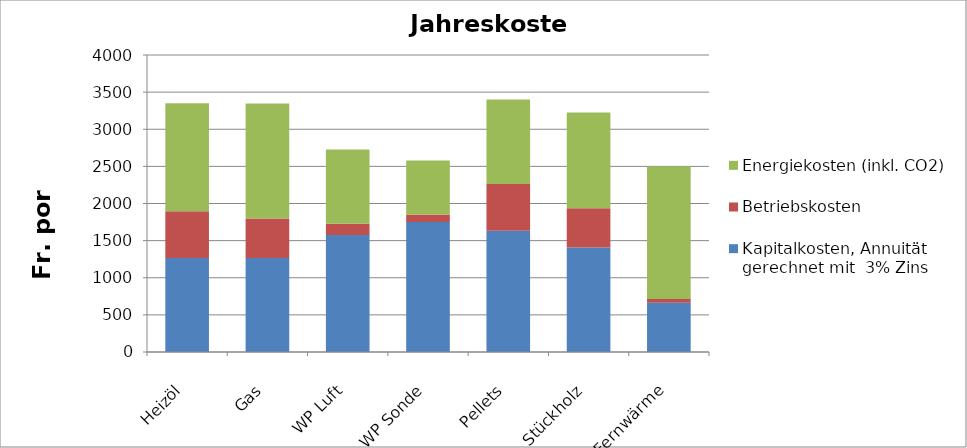
| Category | Kapitalkosten, Annuität gerechnet mit  3% Zins | Betriebskosten | Energiekosten (inkl. CO2) |
|---|---|---|---|
| Heizöl | 1266.3 | 630 | 1455 |
| Gas | 1266.3 | 530 | 1550 |
| WP Luft | 1575.84 | 150 | 1000.769 |
| WP Sonde | 1752.408 | 100 | 728.333 |
| Pellets | 1632.12 | 630 | 1140 |
| Stückholz | 1407 | 530 | 1286.983 |
| Fernwärme | 664.02 | 50 | 1785 |